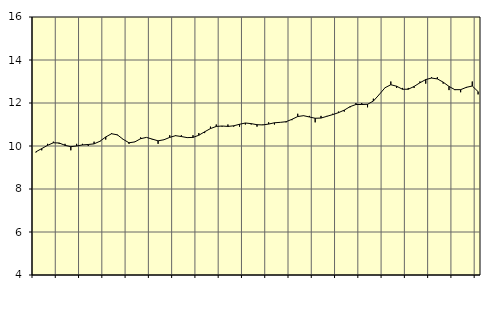
| Category | Piggar | Utbildning, SNI 85 |
|---|---|---|
| nan | 9.7 | 9.73 |
| 1.0 | 9.8 | 9.88 |
| 1.0 | 10.1 | 10.03 |
| 1.0 | 10.2 | 10.15 |
| nan | 10.1 | 10.14 |
| 2.0 | 10.1 | 10.03 |
| 2.0 | 9.8 | 9.97 |
| 2.0 | 10.1 | 10 |
| nan | 10.1 | 10.05 |
| 3.0 | 10 | 10.07 |
| 3.0 | 10.2 | 10.1 |
| 3.0 | 10.2 | 10.22 |
| nan | 10.3 | 10.42 |
| 4.0 | 10.6 | 10.57 |
| 4.0 | 10.5 | 10.52 |
| 4.0 | 10.3 | 10.31 |
| nan | 10.1 | 10.15 |
| 5.0 | 10.2 | 10.19 |
| 5.0 | 10.4 | 10.34 |
| 5.0 | 10.4 | 10.4 |
| nan | 10.3 | 10.32 |
| 6.0 | 10.1 | 10.24 |
| 6.0 | 10.3 | 10.29 |
| 6.0 | 10.5 | 10.4 |
| nan | 10.5 | 10.48 |
| 7.0 | 10.5 | 10.44 |
| 7.0 | 10.4 | 10.39 |
| 7.0 | 10.5 | 10.4 |
| nan | 10.6 | 10.5 |
| 8.0 | 10.6 | 10.66 |
| 8.0 | 10.9 | 10.81 |
| 8.0 | 11 | 10.91 |
| nan | 10.9 | 10.93 |
| 9.0 | 11 | 10.91 |
| 9.0 | 10.9 | 10.94 |
| 9.0 | 10.9 | 11.01 |
| nan | 11 | 11.07 |
| 10.0 | 11 | 11.04 |
| 10.0 | 10.9 | 10.99 |
| 10.0 | 11 | 10.98 |
| nan | 11.1 | 11.02 |
| 11.0 | 11 | 11.08 |
| 11.0 | 11.1 | 11.1 |
| 11.0 | 11.1 | 11.13 |
| nan | 11.2 | 11.24 |
| 12.0 | 11.5 | 11.37 |
| 12.0 | 11.4 | 11.41 |
| 12.0 | 11.4 | 11.35 |
| nan | 11.1 | 11.29 |
| 13.0 | 11.4 | 11.3 |
| 13.0 | 11.4 | 11.38 |
| 13.0 | 11.5 | 11.46 |
| nan | 11.6 | 11.55 |
| 14.0 | 11.6 | 11.67 |
| 14.0 | 11.8 | 11.83 |
| 14.0 | 12 | 11.93 |
| nan | 12 | 11.93 |
| 15.0 | 11.8 | 11.94 |
| 15.0 | 12.2 | 12.09 |
| 15.0 | 12.4 | 12.39 |
| nan | 12.7 | 12.71 |
| 16.0 | 13 | 12.85 |
| 16.0 | 12.7 | 12.78 |
| 16.0 | 12.7 | 12.64 |
| nan | 12.7 | 12.64 |
| 17.0 | 12.7 | 12.77 |
| 17.0 | 13 | 12.94 |
| 17.0 | 12.9 | 13.09 |
| nan | 13.2 | 13.16 |
| 18.0 | 13.2 | 13.12 |
| 18.0 | 12.9 | 12.97 |
| 18.0 | 12.6 | 12.77 |
| nan | 12.6 | 12.62 |
| 19.0 | 12.5 | 12.62 |
| 19.0 | 12.7 | 12.73 |
| 19.0 | 13 | 12.79 |
| nan | 12.4 | 12.53 |